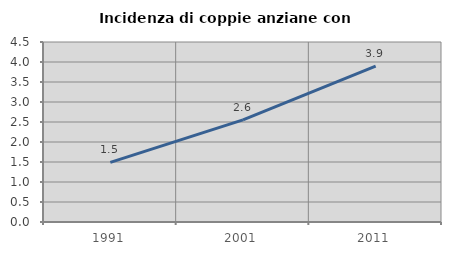
| Category | Incidenza di coppie anziane con figli |
|---|---|
| 1991.0 | 1.489 |
| 2001.0 | 2.552 |
| 2011.0 | 3.895 |